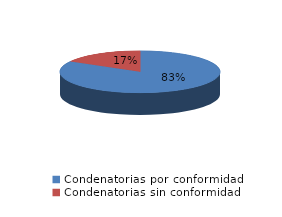
| Category | Series 0 |
|---|---|
| 0 | 20 |
| 1 | 4 |